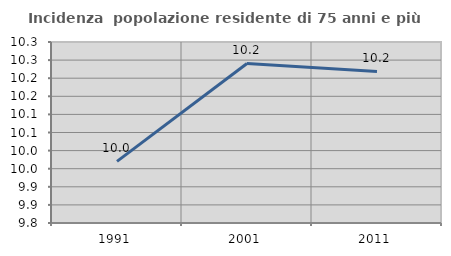
| Category | Incidenza  popolazione residente di 75 anni e più |
|---|---|
| 1991.0 | 9.97 |
| 2001.0 | 10.241 |
| 2011.0 | 10.219 |